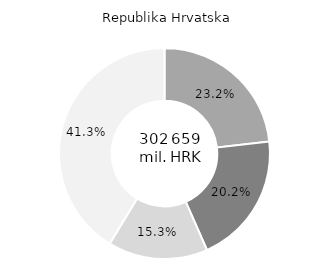
| Category | Series 0 |
|---|---|
| G, H, I | 23.2 |
| B, C, D, E | 20.2 |
| O, P, Q | 15.3 |
| Ostale djelatnosti | 41.3 |